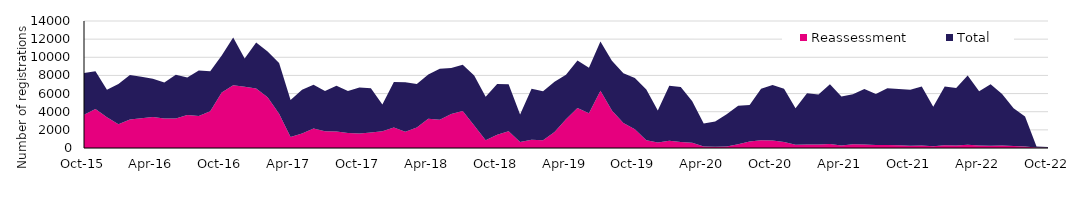
| Category | Reassessment | Total |
|---|---|---|
| 2022-10-01 | 22 | 86 |
| 2022-09-01 | 57 | 104 |
| 2022-08-01 | 165 | 3315 |
| 2022-07-01 | 210 | 4168 |
| 2022-06-01 | 263 | 5679 |
| 2022-05-01 | 252 | 6781 |
| 2022-04-01 | 267 | 5976 |
| 2022-03-01 | 365 | 7639 |
| 2022-02-01 | 286 | 6337 |
| 2022-01-01 | 301 | 6489 |
| 2021-12-01 | 188 | 4363 |
| 2021-11-01 | 275 | 6492 |
| 2021-10-01 | 246 | 6169 |
| 2021-09-01 | 291 | 6218 |
| 2021-08-01 | 325 | 6248 |
| 2021-07-01 | 338 | 5622 |
| 2021-06-01 | 398 | 6093 |
| 2021-05-01 | 420 | 5501 |
| 2021-04-01 | 284 | 5389 |
| 2021-03-01 | 453 | 6567 |
| 2021-02-01 | 375 | 5517 |
| 2021-01-01 | 386 | 5642 |
| 2020-12-01 | 371 | 4007 |
| 2020-11-01 | 662 | 5859 |
| 2020-10-01 | 827 | 6128 |
| 2020-09-01 | 853 | 5684 |
| 2020-08-01 | 725 | 4006 |
| 2020-07-01 | 415 | 4256 |
| 2020-06-01 | 152 | 3573 |
| 2020-05-01 | 137 | 2789 |
| 2020-04-01 | 159 | 2530 |
| 2020-03-01 | 570 | 4583 |
| 2020-02-01 | 654 | 6082 |
| 2020-01-01 | 796 | 6076 |
| 2019-12-01 | 599 | 3537 |
| 2019-11-01 | 856 | 5584 |
| 2019-10-01 | 2060 | 5666 |
| 2019-09-01 | 2752 | 5486 |
| 2019-08-01 | 4130 | 5485 |
| 2019-07-01 | 6316 | 5430 |
| 2019-06-01 | 3840 | 4995 |
| 2019-05-01 | 4415 | 5222 |
| 2019-04-01 | 3158 | 4909 |
| 2019-03-01 | 1758 | 5556 |
| 2019-02-01 | 857 | 5402 |
| 2019-01-01 | 912 | 5614 |
| 2018-12-01 | 650 | 3033 |
| 2018-11-01 | 1850 | 5182 |
| 2018-10-01 | 1470 | 5581 |
| 2018-09-01 | 864 | 4793 |
| 2018-08-01 | 2469 | 5533 |
| 2018-07-01 | 4075 | 5092 |
| 2018-06-01 | 3754 | 5075 |
| 2018-05-01 | 3123 | 5619 |
| 2018-04-01 | 3217 | 4884 |
| 2018-03-01 | 2247 | 4803 |
| 2018-02-01 | 1785 | 5461 |
| 2018-01-01 | 2260 | 5021 |
| 2017-12-01 | 1843 | 2964 |
| 2017-11-01 | 1705 | 4881 |
| 2017-10-01 | 1593 | 5074 |
| 2017-09-01 | 1666 | 4618 |
| 2017-08-01 | 1810 | 5063 |
| 2017-07-01 | 1859 | 4415 |
| 2017-06-01 | 2147 | 4838 |
| 2017-05-01 | 1610 | 4804 |
| 2017-04-01 | 1207 | 4082 |
| 2017-03-01 | 3773 | 5602 |
| 2017-02-01 | 5602 | 5027 |
| 2017-01-01 | 6567 | 5055 |
| 2016-12-01 | 6749 | 3120 |
| 2016-11-01 | 6906 | 5283 |
| 2016-10-01 | 6126 | 4076 |
| 2016-09-01 | 4045 | 4404 |
| 2016-08-01 | 3540 | 5003 |
| 2016-07-01 | 3626 | 4151 |
| 2016-06-01 | 3255 | 4832 |
| 2016-05-01 | 3241 | 3967 |
| 2016-04-01 | 3405 | 4236 |
| 2016-03-01 | 3279 | 4567 |
| 2016-02-01 | 3143 | 4899 |
| 2016-01-01 | 2617 | 4449 |
| 2015-12-01 | 3378 | 3034 |
| 2015-11-01 | 4290 | 4182 |
| 2015-10-01 | 3673 | 4593 |